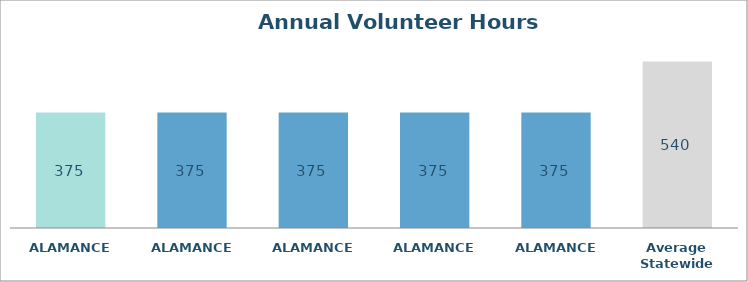
| Category | Series 0 |
|---|---|
| ALAMANCE  | 375 |
| ALAMANCE  | 375 |
| ALAMANCE  | 375 |
| ALAMANCE  | 375 |
| ALAMANCE  | 375 |
| Average Statewide | 539.667 |